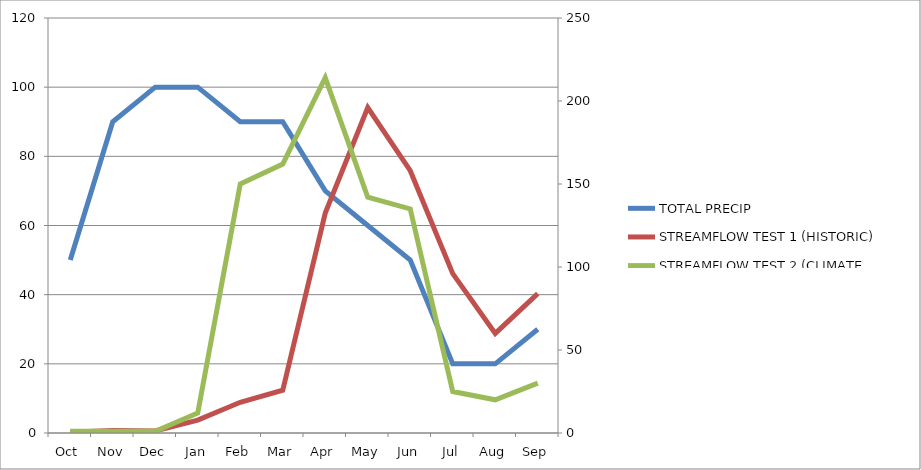
| Category | TOTAL PRECIP |
|---|---|
| Oct | 50 |
| Nov | 90 |
| Dec | 100 |
| Jan | 100 |
| Feb | 90 |
| Mar | 90 |
| Apr | 70 |
| May | 60 |
| Jun | 50 |
| Jul | 20 |
| Aug | 20 |
| Sep | 30 |